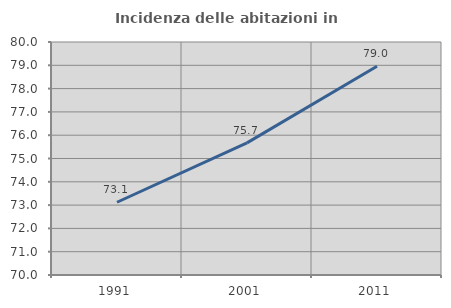
| Category | Incidenza delle abitazioni in proprietà  |
|---|---|
| 1991.0 | 73.122 |
| 2001.0 | 75.671 |
| 2011.0 | 78.956 |